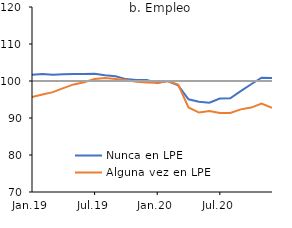
| Category | Nunca en LPE | Alguna vez en LPE | Series 2 |
|---|---|---|---|
| 2019-01-01 | 101.667 | 95.644 | 100 |
| 2019-02-01 | 101.892 | 96.359 | 100 |
| 2019-03-01 | 101.666 | 96.984 | 100 |
| 2019-04-01 | 101.805 | 98.068 | 100 |
| 2019-05-01 | 101.874 | 99.073 | 100 |
| 2019-06-01 | 101.868 | 99.67 | 100 |
| 2019-07-01 | 101.964 | 100.568 | 100 |
| 2019-08-01 | 101.537 | 100.788 | 100 |
| 2019-09-01 | 101.284 | 100.563 | 100 |
| 2019-10-01 | 100.514 | 100.241 | 100 |
| 2019-11-01 | 100.283 | 99.777 | 100 |
| 2019-12-01 | 100.246 | 99.586 | 100 |
| 2020-01-01 | 99.471 | 99.502 | 100 |
| 2020-02-01 | 100 | 100 | 100 |
| 2020-03-01 | 98.837 | 99.054 | 100 |
| 2020-04-01 | 95.046 | 92.848 | 100 |
| 2020-05-01 | 94.373 | 91.474 | 100 |
| 2020-06-01 | 94.118 | 91.91 | 100 |
| 2020-07-01 | 95.263 | 91.37 | 100 |
| 2020-08-01 | 95.344 | 91.378 | 100 |
| 2020-09-01 | 97.281 | 92.336 | 100 |
| 2020-10-01 | 99.128 | 92.819 | 100 |
| 2020-11-01 | 100.872 | 93.873 | 100 |
| 2020-12-01 | 100.839 | 92.748 | 100 |